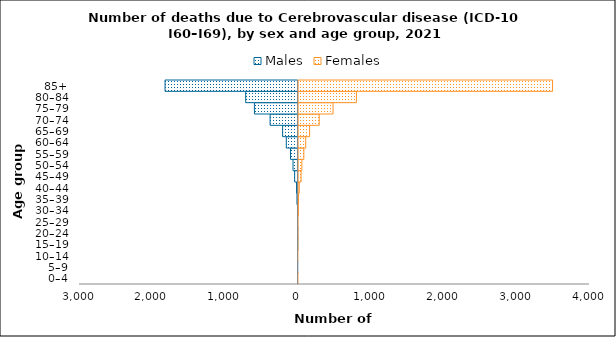
| Category | Males | Females |
|---|---|---|
| 0–4 | 0 | 2 |
| 5–9 | -3 | 0 |
| 10–14 | 0 | 1 |
| 15–19 | -2 | 2 |
| 20–24 | -2 | 3 |
| 25–29 | -8 | 5 |
| 30–34 | -8 | 9 |
| 35–39 | -15 | 13 |
| 40–44 | -21 | 23 |
| 45–49 | -47 | 48 |
| 50–54 | -69 | 59 |
| 55–59 | -104 | 86 |
| 60–64 | -161 | 112 |
| 65–69 | -212 | 165 |
| 70–74 | -384 | 297 |
| 75–79 | -599 | 487 |
| 80–84 | -719 | 808 |
| 85+ | -1826 | 3500 |